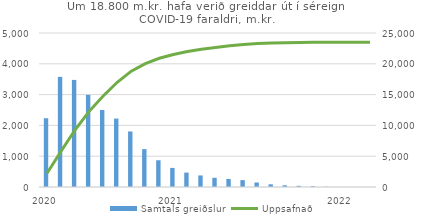
| Category | Samtals greiðslur |
|---|---|
| 2020.0 | 2232.97 |
| nan | 3576.216 |
| nan | 3477.115 |
| nan | 2992.981 |
| nan | 2499.882 |
| nan | 2221.189 |
| nan | 1802.995 |
| nan | 1229.39 |
| nan | 868.257 |
| 2021.0 | 619.664 |
| nan | 466.965 |
| nan | 375.306 |
| nan | 299.496 |
| nan | 259.448 |
| nan | 223.881 |
| nan | 146.237 |
| nan | 87.048 |
| nan | 55.539 |
| nan | 38.476 |
| nan | 26.311 |
| nan | 7.644 |
| 2022.0 | 1.265 |
| nan | 0 |
| nan | 0 |